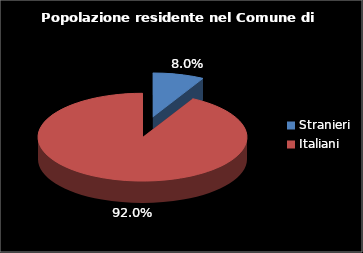
| Category | Series 0 |
|---|---|
| Stranieri | 1164 |
| Italiani | 13477 |